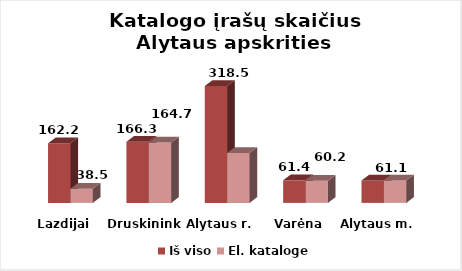
| Category | Iš viso | El. kataloge |
|---|---|---|
| Lazdijai | 162.2 | 38.5 |
| Druskininkai | 166.3 | 164.7 |
| Alytaus r. | 318.5 | 135.9 |
| Varėna | 61.4 | 60.2 |
| Alytaus m. | 61.1 | 61.1 |